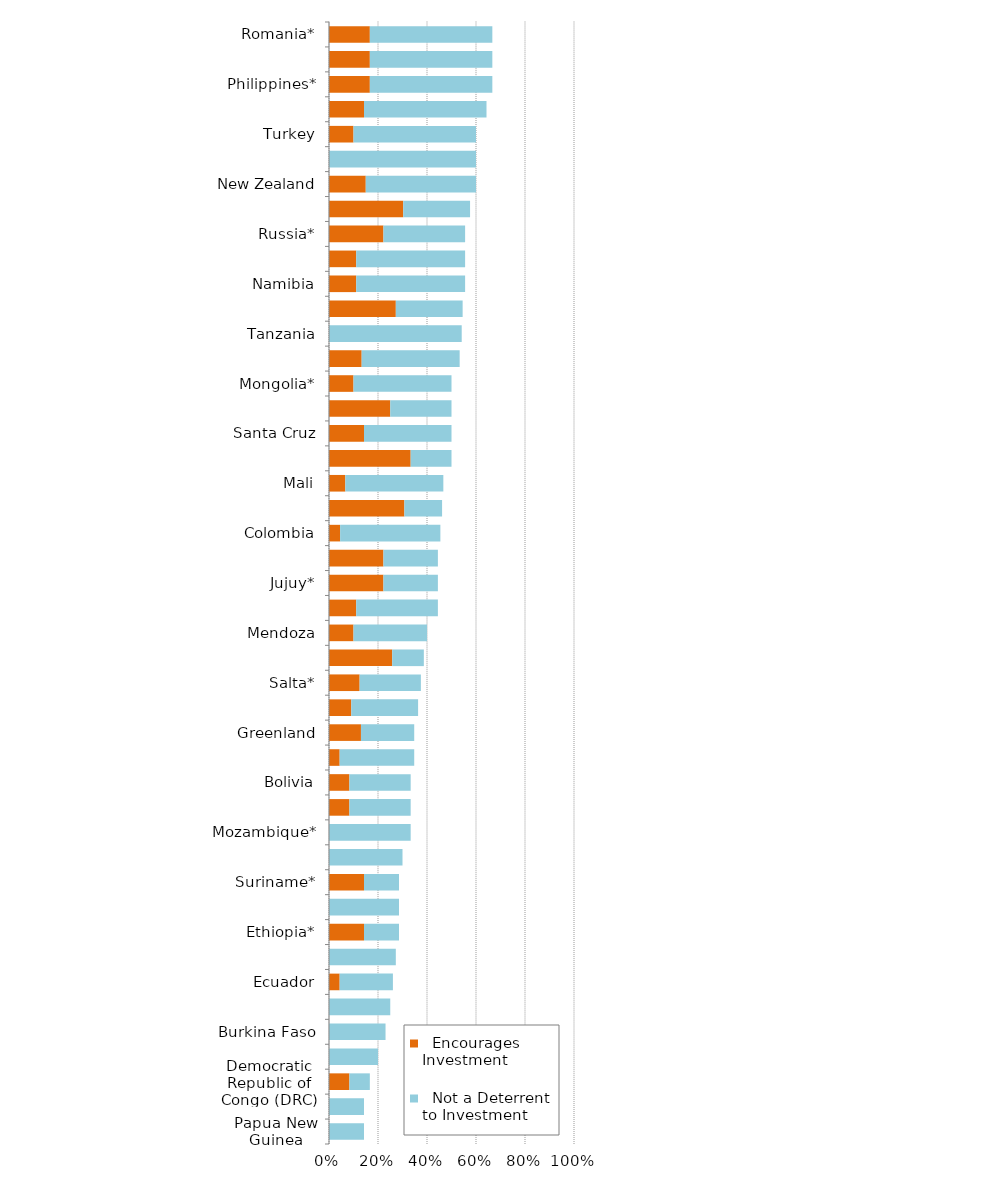
| Category |   Encourages Investment |   Not a Deterrent to Investment |
|---|---|---|
| Papua New Guinea | 0 | 0.143 |
| Venezuela | 0 | 0.143 |
| Democratic Republic of Congo (DRC) | 0.083 | 0.083 |
| Guatemala | 0 | 0.2 |
| Burkina Faso | 0 | 0.231 |
| Panama* | 0 | 0.25 |
| Ecuador | 0.043 | 0.217 |
| Nicaragua* | 0 | 0.273 |
| Ethiopia* | 0.143 | 0.143 |
| Guyana* | 0 | 0.286 |
| Suriname* | 0.143 | 0.143 |
| Ivory Coast* | 0 | 0.3 |
| Mozambique* | 0 | 0.333 |
| Zimbabwe | 0.083 | 0.25 |
| Bolivia | 0.083 | 0.25 |
| Indonesia | 0.043 | 0.304 |
| Greenland | 0.13 | 0.217 |
| French Guiana | 0.091 | 0.273 |
| Salta* | 0.125 | 0.25 |
| Nunavut | 0.258 | 0.129 |
| Mendoza | 0.1 | 0.3 |
| Chubut* | 0.111 | 0.333 |
| Jujuy* | 0.222 | 0.222 |
| China* | 0.222 | 0.222 |
| Colombia | 0.045 | 0.409 |
| Fiji | 0.308 | 0.154 |
| Mali | 0.067 | 0.4 |
| Morocco* | 0.333 | 0.167 |
| Santa Cruz | 0.143 | 0.357 |
| Brazil | 0.25 | 0.25 |
| Mongolia* | 0.1 | 0.4 |
| Zambia | 0.133 | 0.4 |
| Tanzania | 0 | 0.542 |
| Botswana* | 0.273 | 0.273 |
| Namibia | 0.111 | 0.444 |
| Dominican Republic* | 0.111 | 0.444 |
| Russia* | 0.222 | 0.333 |
| Northwest Territories | 0.303 | 0.273 |
| New Zealand | 0.15 | 0.45 |
| Kenya* | 0 | 0.6 |
| Turkey | 0.1 | 0.5 |
| San Juan | 0.143 | 0.5 |
| Philippines* | 0.167 | 0.5 |
| La Rioja* | 0.167 | 0.5 |
| Romania* | 0.167 | 0.5 |